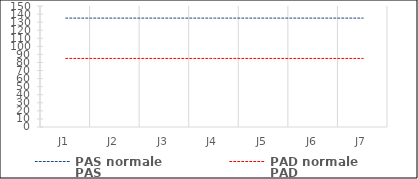
| Category | PAS normale | PAD normale | PAS | PAD |
|---|---|---|---|---|
| J1 | 135 | 85 | 0 | 0 |
| J2 | 135 | 85 | 0 | 0 |
| J3 | 135 | 85 | 0 | 0 |
| J4 | 135 | 85 | 0 | 0 |
| J5 | 135 | 85 | 0 | 0 |
| J6 | 135 | 85 | 0 | 0 |
| J7 | 135 | 85 | 0 | 0 |